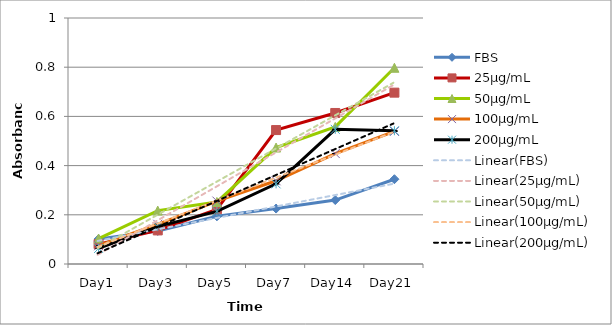
| Category | FBS | 25µg/mL | 50µg/mL | 100µg/mL | 200µg/mL |
|---|---|---|---|---|---|
| Day1 | 0.101 | 0.081 | 0.104 | 0.074 | 0.063 |
| Day3 | 0.134 | 0.137 | 0.217 | 0.161 | 0.152 |
| Day5 | 0.194 | 0.222 | 0.252 | 0.256 | 0.214 |
| Day7 | 0.225 | 0.544 | 0.473 | 0.338 | 0.326 |
| Day14 | 0.26 | 0.614 | 0.557 | 0.449 | 0.547 |
| Day21 | 0.345 | 0.697 | 0.798 | 0.539 | 0.542 |